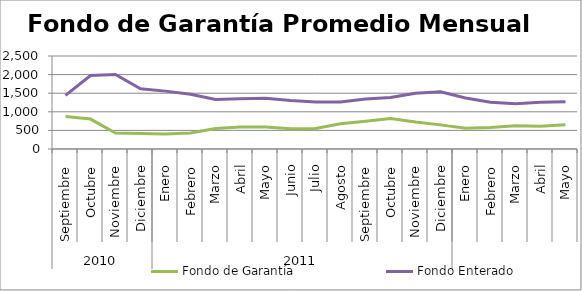
| Category | Fondo de Garantía | Fondo Enterado |
|---|---|---|
| 0 | 871.43 | 1439.553 |
| 1 | 804.208 | 1973.732 |
| 2 | 428.758 | 2004.096 |
| 3 | 417.974 | 1620.905 |
| 4 | 403.651 | 1555.632 |
| 5 | 429.02 | 1474.054 |
| 6 | 551.344 | 1328.521 |
| 7 | 591.732 | 1351.463 |
| 8 | 591.784 | 1363.301 |
| 9 | 544.875 | 1304.985 |
| 10 | 551.606 | 1265.502 |
| 11 | 679.839 | 1266.018 |
| 12 | 747.74 | 1344.929 |
| 13 | 819.75 | 1383.171 |
| 14 | 723.635 | 1501.378 |
| 15 | 648.288 | 1537.485 |
| 16 | 560.173 | 1370.992 |
| 17 | 575.916 | 1258.831 |
| 18 | 622.075 | 1216.471 |
| 19 | 612.299 | 1258.963 |
| 20 | 654.277 | 1273.362 |